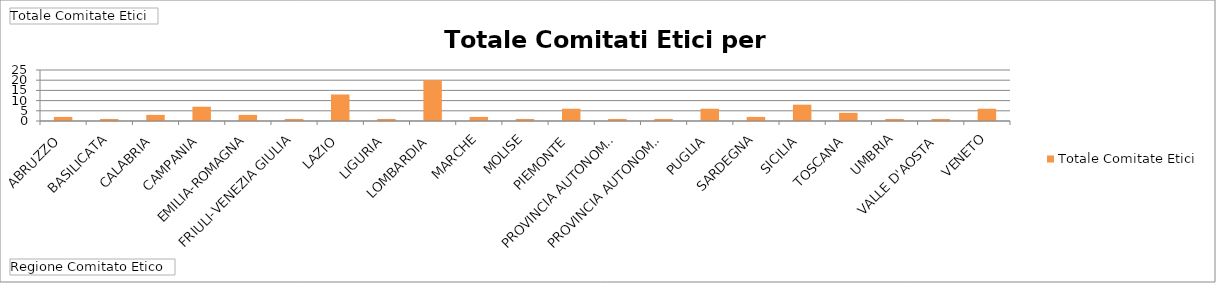
| Category | Totale |
|---|---|
| ABRUZZO | 2 |
| BASILICATA | 1 |
| CALABRIA | 3 |
| CAMPANIA | 7 |
| EMILIA-ROMAGNA | 3 |
| FRIULI-VENEZIA GIULIA | 1 |
| LAZIO | 13 |
| LIGURIA | 1 |
| LOMBARDIA | 20 |
| MARCHE | 2 |
| MOLISE | 1 |
| PIEMONTE | 6 |
| PROVINCIA AUTONOMA DI BOLZANO | 1 |
| PROVINCIA AUTONOMA DI TRENTO | 1 |
| PUGLIA | 6 |
| SARDEGNA | 2 |
| SICILIA | 8 |
| TOSCANA | 4 |
| UMBRIA | 1 |
| VALLE D'AOSTA | 1 |
| VENETO | 6 |